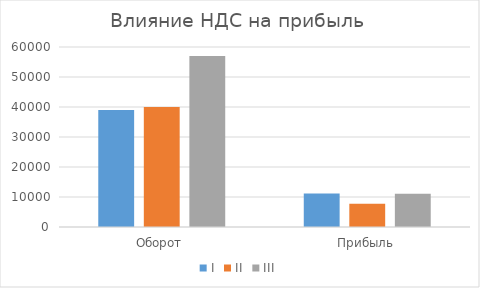
| Category | I | II | III |
|---|---|---|---|
| Оборот | 39000 | 40000 | 57000 |
| Прибыль | 11200 | 7749.099 | 11042.467 |